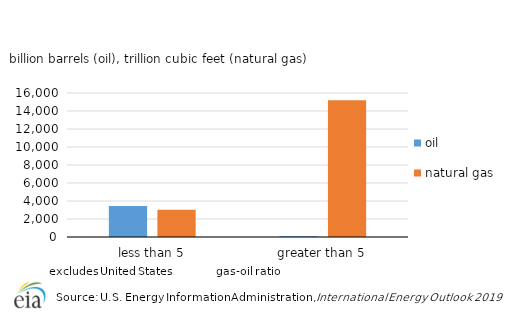
| Category | oil | natural gas |
|---|---|---|
| less than 5 | 3448.3 | 3015.9 |
| greater than 5 | 87.5 | 15200.6 |